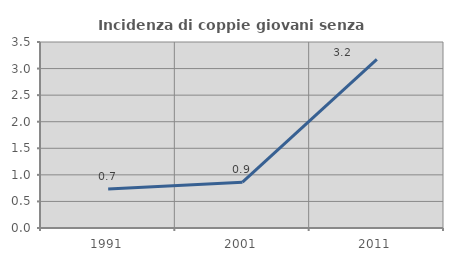
| Category | Incidenza di coppie giovani senza figli |
|---|---|
| 1991.0 | 0.735 |
| 2001.0 | 0.862 |
| 2011.0 | 3.175 |